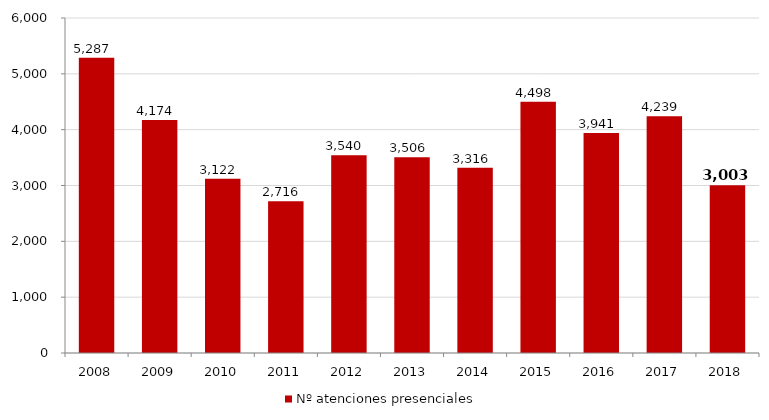
| Category | Nº atenciones presenciales |
|---|---|
| 2008.0 | 5287 |
| 2009.0 | 4174 |
| 2010.0 | 3122 |
| 2011.0 | 2716 |
| 2012.0 | 3540 |
| 2013.0 | 3506 |
| 2014.0 | 3316 |
| 2015.0 | 4498 |
| 2016.0 | 3941 |
| 2017.0 | 4239 |
| 2018.0 | 3003 |